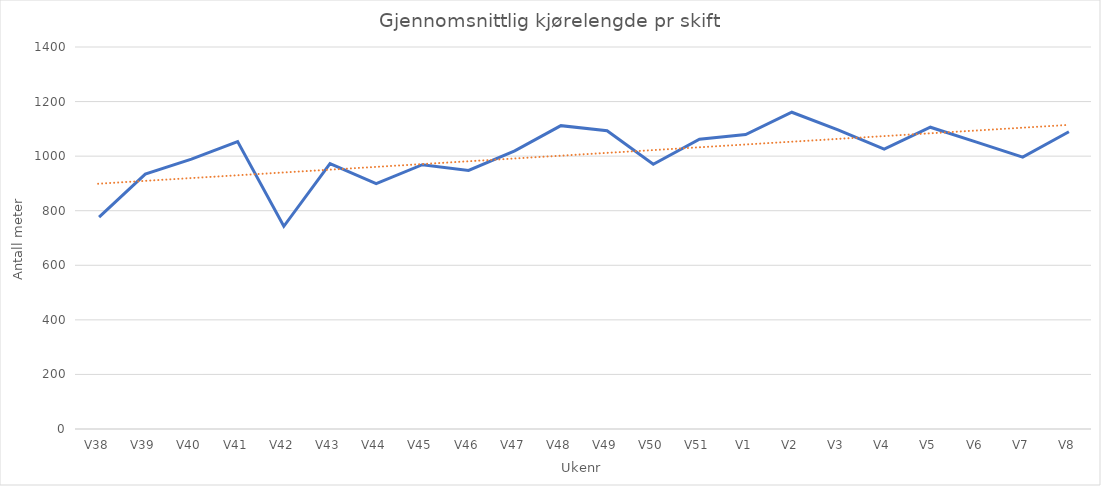
| Category | Gjennomsnittlig kjørelengde pr skift |
|---|---|
| V38 | 776.24 |
| V39 | 934.394 |
| V40 | 989.208 |
| V41 | 1053.636 |
| V42 | 742.876 |
| V43 | 972.377 |
| V44 | 899.318 |
| V45 | 968.644 |
| V46 | 947.843 |
| V47 | 1019.244 |
| V48 | 1111.731 |
| V49 | 1093.376 |
| V50 | 970.131 |
| V51 | 1061.769 |
| V1 | 1078.911 |
| V2 | 1160.89 |
| V3 | 1096.136 |
| V4 | 1025.835 |
| V5 | 1106.002 |
| V6 | 1051.483 |
| V7 | 996.207 |
| V8 | 1089.256 |